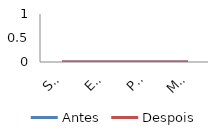
| Category | Antes | Despois |
|---|---|---|
| Soma | 0 | 0 |
| Energ | 0 | 0 |
| Psicos | 0 | 0 |
| Mental | 0 | 0 |